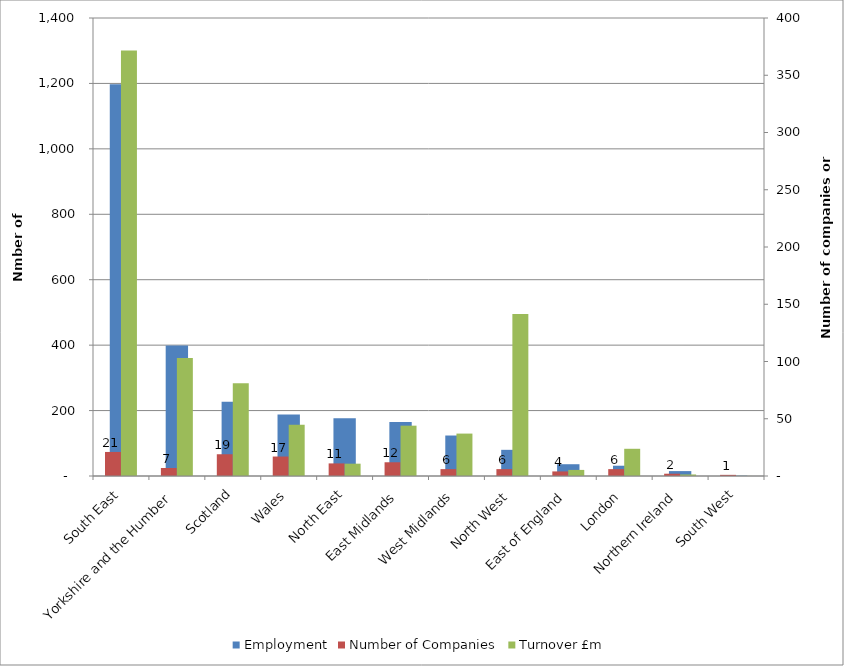
| Category | Employment |
|---|---|
| South East | 1197.5 |
| Yorkshire and the Humber | 398.6 |
| Scotland | 226.7 |
| Wales | 188 |
| North East | 176.7 |
| East Midlands | 165.35 |
| West Midlands | 123.75 |
| North West | 80 |
| East of England | 36 |
| London | 31.42 |
| Northern Ireland | 15 |
| South West | 1 |